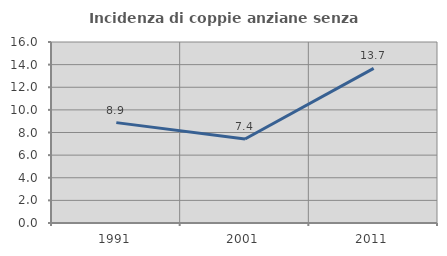
| Category | Incidenza di coppie anziane senza figli  |
|---|---|
| 1991.0 | 8.873 |
| 2001.0 | 7.426 |
| 2011.0 | 13.673 |